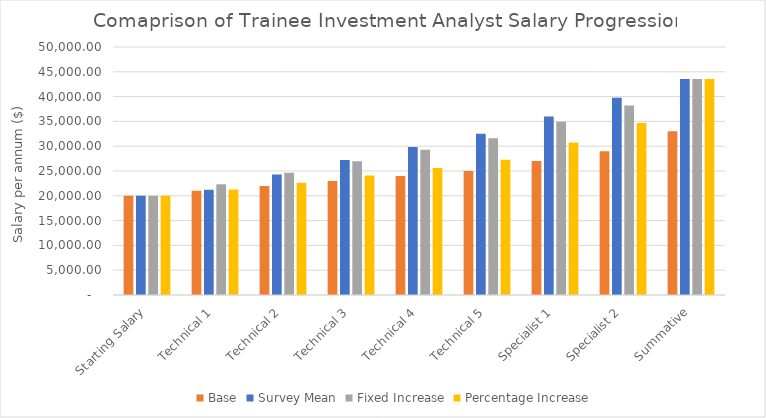
| Category | Base | Survey Mean | Fixed Increase | Percentage Increase |
|---|---|---|---|---|
| Starting Salary | 20000 | 20000 | 20000 | 20000 |
| Technical 1 | 21000 | 21227.633 | 22317.948 | 21278.301 |
| Technical 2 | 22000 | 24293.286 | 24635.895 | 22638.304 |
| Technical 3 | 23000 | 27200.265 | 26953.843 | 24085.232 |
| Technical 4 | 24000 | 29840.391 | 29271.791 | 25624.64 |
| Technical 5 | 25000 | 32517.043 | 31589.738 | 27262.44 |
| Specialist 1 | 27000 | 35979.703 | 34907.686 | 30747.399 |
| Specialist 2 | 29000 | 39770.098 | 38225.634 | 34677.841 |
| Summative | 33000 | 43543.581 | 43543.581 | 43543.581 |